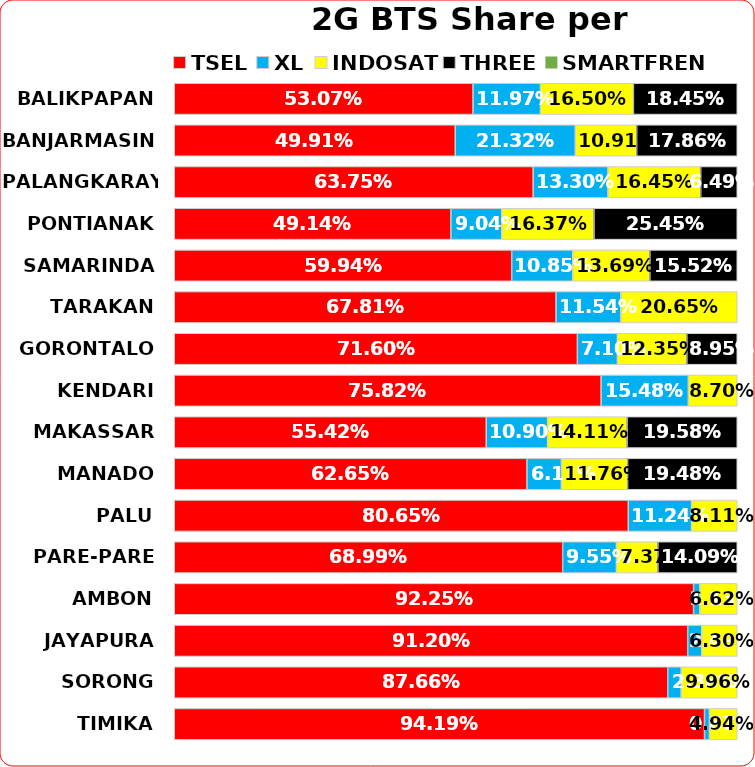
| Category | TSEL | XL | INDOSAT | THREE | SMARTFREN |
|---|---|---|---|---|---|
| BALIKPAPAN | 0.531 | 0.12 | 0.165 | 0.184 | 0 |
| BANJARMASIN | 0.499 | 0.213 | 0.109 | 0.179 | 0 |
| PALANGKARAYA | 0.638 | 0.133 | 0.165 | 0.065 | 0 |
| PONTIANAK | 0.491 | 0.09 | 0.164 | 0.254 | 0 |
| SAMARINDA | 0.599 | 0.109 | 0.137 | 0.155 | 0 |
| TARAKAN | 0.678 | 0.115 | 0.206 | 0 | 0 |
| GORONTALO | 0.716 | 0.071 | 0.123 | 0.09 | 0 |
| KENDARI | 0.758 | 0.155 | 0.087 | 0 | 0 |
| MAKASSAR | 0.554 | 0.109 | 0.141 | 0.196 | 0 |
| MANADO | 0.627 | 0.061 | 0.118 | 0.195 | 0 |
| PALU | 0.806 | 0.112 | 0.081 | 0 | 0 |
| PARE-PARE | 0.69 | 0.095 | 0.074 | 0.141 | 0 |
| AMBON | 0.922 | 0.011 | 0.066 | 0 | 0 |
| JAYAPURA | 0.912 | 0.025 | 0.063 | 0 | 0 |
| SORONG | 0.877 | 0.024 | 0.1 | 0 | 0 |
| TIMIKA | 0.942 | 0.009 | 0.049 | 0 | 0 |